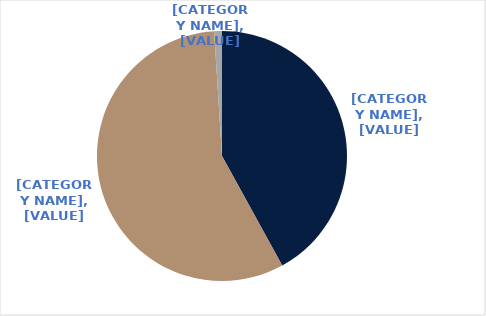
| Category | Series 0 |
|---|---|
| Premium | 0.42 |
| A Grade | 0.57 |
| B Grade | 0.01 |